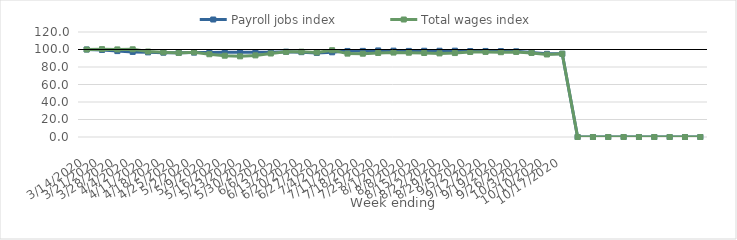
| Category | Payroll jobs index | Total wages index |
|---|---|---|
| 14/03/2020 | 100 | 100 |
| 21/03/2020 | 99.481 | 100.424 |
| 28/03/2020 | 98.177 | 100.098 |
| 04/04/2020 | 97.25 | 100.228 |
| 11/04/2020 | 96.719 | 97.662 |
| 18/04/2020 | 96.378 | 96.776 |
| 25/04/2020 | 96.302 | 96.096 |
| 02/05/2020 | 96.449 | 96.849 |
| 09/05/2020 | 96.568 | 94.574 |
| 16/05/2020 | 96.863 | 92.928 |
| 23/05/2020 | 96.844 | 92.195 |
| 30/05/2020 | 96.852 | 93.272 |
| 06/06/2020 | 96.733 | 95.426 |
| 13/06/2020 | 97.459 | 97.287 |
| 20/06/2020 | 96.963 | 97.478 |
| 27/06/2020 | 96.067 | 96.625 |
| 04/07/2020 | 96.8 | 99.169 |
| 11/07/2020 | 98.332 | 95.298 |
| 18/07/2020 | 98.428 | 95.206 |
| 25/07/2020 | 98.944 | 96.022 |
| 01/08/2020 | 98.695 | 96.497 |
| 08/08/2020 | 98.392 | 96.336 |
| 15/08/2020 | 98.568 | 95.996 |
| 22/08/2020 | 98.589 | 95.544 |
| 29/08/2020 | 98.666 | 95.929 |
| 05/09/2020 | 98.207 | 97.126 |
| 12/09/2020 | 98.33 | 97.221 |
| 19/09/2020 | 98.14 | 96.923 |
| 26/09/2020 | 97.93 | 97.201 |
| 03/10/2020 | 96.585 | 96.089 |
| 10/10/2020 | 95.047 | 94.32 |
| 17/10/2020 | 95.127 | 95.144 |